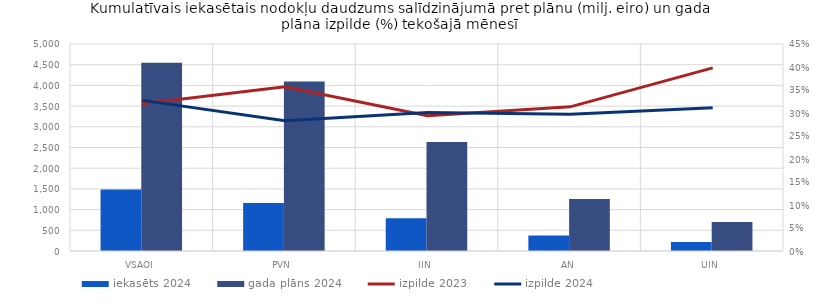
| Category | iekasēts 2024 | gada plāns 2024 |
|---|---|---|
| VSAOI | 1488.256 | 4544.733 |
| PVN | 1159.741 | 4096.678 |
| IIN | 792.813 | 2634.714 |
| AN | 373.267 | 1254.984 |
| UIN | 217.206 | 697.842 |